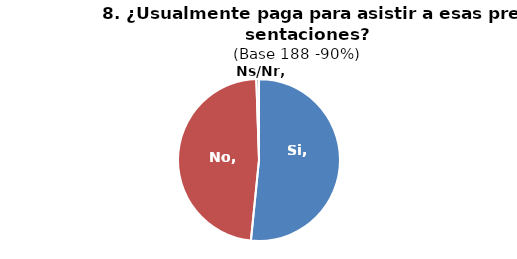
| Category | Series 0 |
|---|---|
| Si | 0.516 |
| No | 0.479 |
| Ns/Nr | 0.005 |